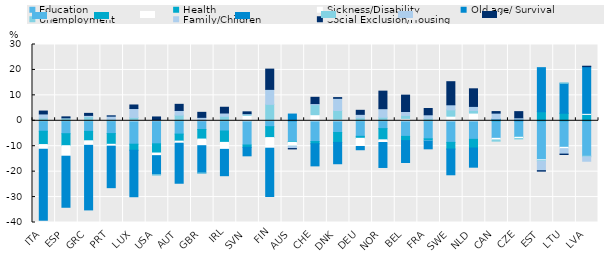
| Category | Education | Health | Sickness/Disability | Old age/ Survival | Unemployment | Family/Children | Social Exclusion/Housing |
|---|---|---|---|---|---|---|---|
| ITA | -4.118 | -5.233 | -1.844 | -27.913 | 1.101 | 1.587 | 1.138 |
| ESP | -5.077 | -4.719 | -4.135 | -20.079 | 1.079 | 0.086 | 0.382 |
| GRC | -4.164 | -3.702 | -1.789 | -25.393 | 1.627 | 0.496 | 0.795 |
| PRT | -5.028 | -4.218 | -0.74 | -16.317 | 0.618 | 1.206 | 0.122 |
| LUX | -9.21 | -2.368 | 0.336 | -18.287 | 0.981 | 3.499 | 1.4 |
| USA | -9.052 | -3.628 | -1.033 | -7.495 | -0.093 | 0.51 | 0.996 |
| AUT | -5.235 | -2.761 | -0.821 | -15.746 | 2.224 | 1.84 | 2.407 |
| GBR | -3.428 | -3.76 | -2.612 | -10.751 | -0.008 | 1.348 | 1.975 |
| IRL | -4.018 | -4.472 | -2.746 | -10.359 | 1.759 | 1.301 | 2.265 |
| SVN | -9.521 | -0.904 | 2.133 | -3.355 | 0.431 | 0.235 | 0.721 |
| FIN | -2.321 | -4.286 | -4.173 | -18.989 | 6.461 | 5.888 | 7.974 |
| AUS | -8.12 | -0.325 | -1.531 | 2.645 | -0.117 | -0.824 | -0.14 |
| CHE | -8.158 | -0.867 | 2.391 | -8.704 | 3.935 | 0.435 | 2.473 |
| DNK | -4.616 | -3.887 | 0.578 | -8.388 | 3.455 | 4.801 | 0.284 |
| DEU | -6.106 | -0.783 | -3.213 | -1.284 | 1.193 | 1.338 | 1.589 |
| NOR | -3.077 | -4.404 | -1.064 | -9.815 | 1.394 | 3.366 | 6.899 |
| BEL | -6.136 | -1.668 | 0.939 | -8.59 | 1.173 | 1.545 | 6.432 |
| FRA | -7.097 | -0.787 | -0.02 | -3.124 | 0.923 | 1.44 | 2.463 |
| SWE | -8.494 | -2.62 | 1.803 | -10.121 | 2.494 | 1.993 | 9.083 |
| NLD | -7.299 | -3.405 | 3.02 | -7.543 | 1.061 | 1.57 | 6.925 |
| CAN | -6.902 | 0.475 | -0.615 | 0.223 | -0.496 | 2.312 | 0.611 |
| CZE | -6.413 | -0.03 | -0.511 | 0.639 | -0.198 | 0.533 | 2.428 |
| EST | -15.353 | 3.557 | -0.33 | 17.336 | -0.221 | -3.715 | -0.182 |
| LTU | -10.434 | 2.96 | -0.522 | 11.803 | 0.105 | -2.144 | -0.155 |
| LVA | -13.899 | 2.509 | 0.419 | 18.356 | -0.297 | -1.719 | 0.175 |